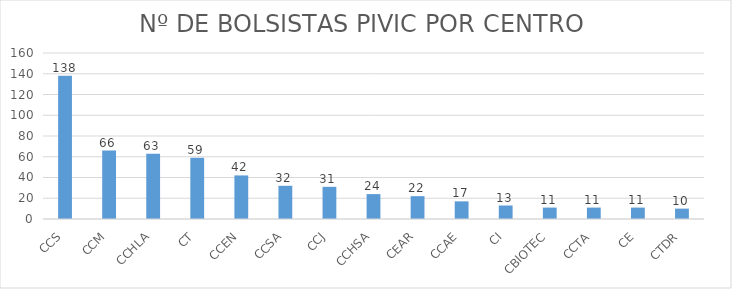
| Category | QTD |
|---|---|
| CCS | 138 |
| CCM | 66 |
| CCHLA | 63 |
| CT | 59 |
| CCEN | 42 |
| CCSA | 32 |
| CCJ | 31 |
| CCHSA | 24 |
| CEAR | 22 |
| CCAE | 17 |
| CI | 13 |
| CBIOTEC | 11 |
| CCTA | 11 |
| CE | 11 |
| CTDR | 10 |